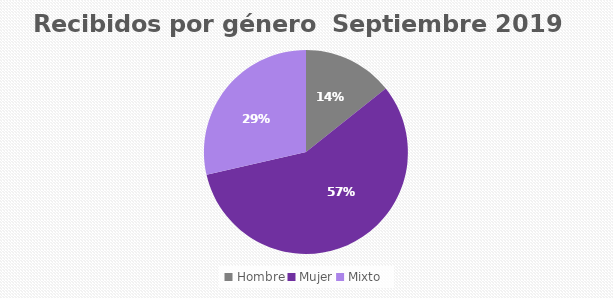
| Category | Recibidos por género  SEPTIEMBRE |
|---|---|
| Hombre | 2 |
| Mujer | 8 |
| Mixto | 4 |